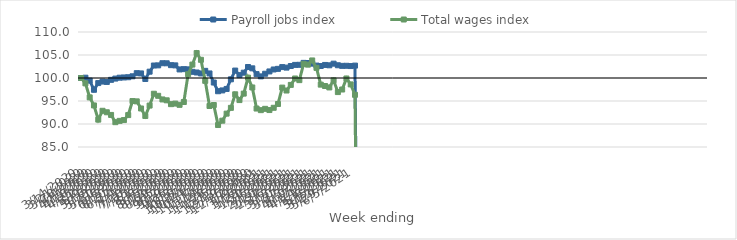
| Category | Payroll jobs index | Total wages index |
|---|---|---|
| 14/03/2020 | 100 | 100 |
| 21/03/2020 | 100.066 | 98.838 |
| 28/03/2020 | 99.437 | 95.788 |
| 04/04/2020 | 97.437 | 94.035 |
| 11/04/2020 | 98.895 | 90.949 |
| 18/04/2020 | 99.225 | 92.871 |
| 25/04/2020 | 99.142 | 92.549 |
| 02/05/2020 | 99.6 | 91.972 |
| 09/05/2020 | 99.871 | 90.397 |
| 16/05/2020 | 100.065 | 90.682 |
| 23/05/2020 | 100.118 | 90.854 |
| 30/05/2020 | 100.169 | 91.936 |
| 06/06/2020 | 100.369 | 94.987 |
| 13/06/2020 | 101.052 | 94.92 |
| 20/06/2020 | 100.997 | 93.376 |
| 27/06/2020 | 99.789 | 91.748 |
| 04/07/2020 | 101.374 | 94.005 |
| 11/07/2020 | 102.712 | 96.578 |
| 18/07/2020 | 102.745 | 96.129 |
| 25/07/2020 | 103.211 | 95.337 |
| 01/08/2020 | 103.197 | 95.149 |
| 08/08/2020 | 102.793 | 94.314 |
| 15/08/2020 | 102.744 | 94.439 |
| 22/08/2020 | 101.864 | 94.165 |
| 29/08/2020 | 101.924 | 94.785 |
| 05/09/2020 | 101.88 | 100.811 |
| 12/09/2020 | 101.345 | 102.916 |
| 19/09/2020 | 101.196 | 105.421 |
| 26/09/2020 | 100.992 | 103.954 |
| 03/10/2020 | 101.555 | 99.38 |
| 10/10/2020 | 100.991 | 93.92 |
| 17/10/2020 | 99.013 | 94.124 |
| 24/10/2020 | 97.12 | 89.779 |
| 31/10/2020 | 97.3 | 90.723 |
| 07/11/2020 | 97.621 | 92.254 |
| 14/11/2020 | 99.713 | 93.51 |
| 21/11/2020 | 101.616 | 96.455 |
| 28/11/2020 | 100.62 | 95.199 |
| 05/12/2020 | 101.155 | 96.606 |
| 12/12/2020 | 102.389 | 100.081 |
| 19/12/2020 | 102.102 | 97.943 |
| 26/12/2020 | 100.849 | 93.36 |
| 02/01/2021 | 100.355 | 93.012 |
| 09/01/2021 | 100.927 | 93.297 |
| 16/01/2021 | 101.426 | 93.033 |
| 23/01/2021 | 101.854 | 93.526 |
| 30/01/2021 | 101.988 | 94.351 |
| 06/02/2021 | 102.372 | 97.912 |
| 13/02/2021 | 102.261 | 97.279 |
| 20/02/2021 | 102.605 | 98.5 |
| 27/02/2021 | 102.848 | 99.894 |
| 06/03/2021 | 102.869 | 99.537 |
| 13/03/2021 | 103.289 | 103.072 |
| 20/03/2021 | 103.258 | 102.904 |
| 27/03/2021 | 103.121 | 103.815 |
| 03/04/2021 | 102.7 | 102.202 |
| 10/04/2021 | 102.61 | 98.557 |
| 17/04/2021 | 102.839 | 98.258 |
| 24/04/2021 | 102.761 | 97.948 |
| 01/05/2021 | 103.118 | 99.492 |
| 08/05/2021 | 102.77 | 96.939 |
| 15/05/2021 | 102.636 | 97.495 |
| 22/05/2021 | 102.656 | 99.892 |
| 29/05/2021 | 102.597 | 98.606 |
| 05/06/2021 | 102.696 | 96.347 |